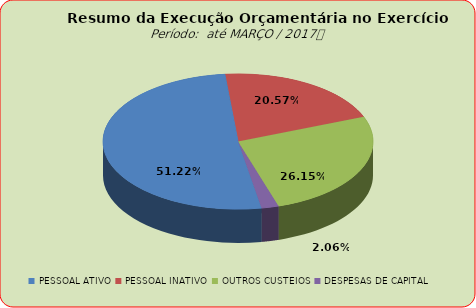
| Category | Series 0 |
|---|---|
| PESSOAL ATIVO | 38173390.95 |
| PESSOAL INATIVO | 15328041.22 |
| OUTROS CUSTEIOS | 19484885.18 |
| DESPESAS DE CAPITAL | 1538546.13 |